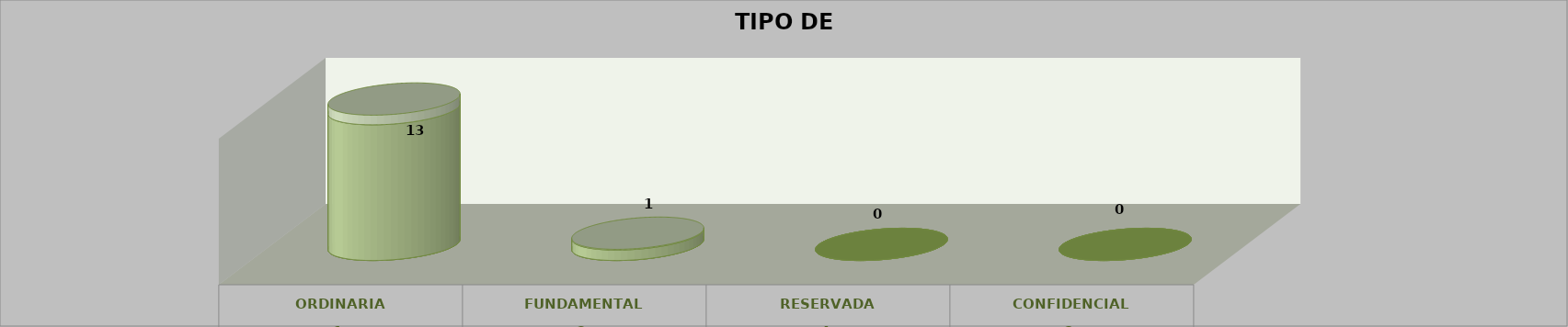
| Category | Series 0 | Series 2 | Series 1 | Series 3 | Series 4 |
|---|---|---|---|---|---|
| 0 |  |  |  | 13 | 0.929 |
| 1 |  |  |  | 1 | 0.071 |
| 2 |  |  |  | 0 | 0 |
| 3 |  |  |  | 0 | 0 |